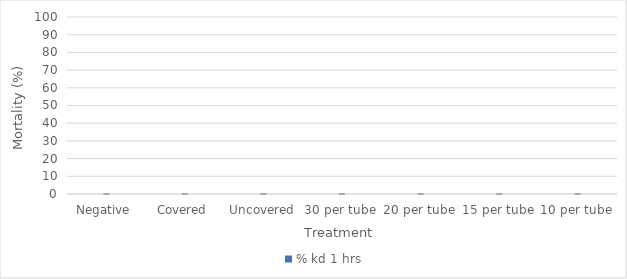
| Category | % kd 1 hrs |
|---|---|
| Negative  | 0 |
| Covered | 0 |
| Uncovered | 0 |
| 30 per tube | 0 |
| 20 per tube | 0 |
| 15 per tube | 0 |
| 10 per tube | 0 |